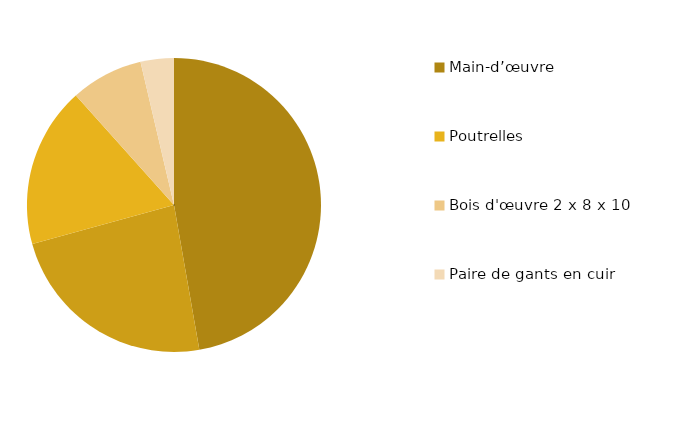
| Category | Series 0 |
|---|---|
| Main-d’œuvre | 200 |
| Bois d'œuvre 2 x 4 x 10 | 99.4 |
| Poutrelles | 74.7 |
| Bois d'œuvre 2 x 8 x 10 | 33.75 |
| Paire de gants en cuir | 15.5 |